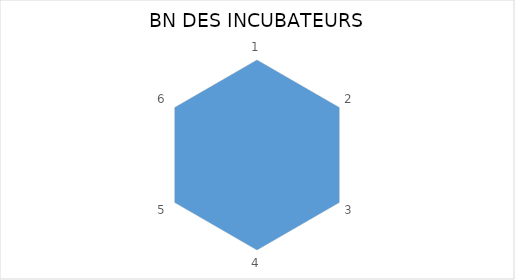
| Category | Series 0 |
|---|---|
| 0 | 1 |
| 1 | 1 |
| 2 | 1 |
| 3 | 1 |
| 4 | 1 |
| 5 | 1 |